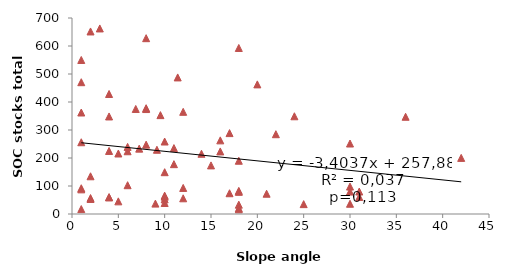
| Category | C_total |
|---|---|
| 6.0 | 102.815 |
| 3.0 | 662.671 |
| 17.0 | 288.947 |
| 1.0 | 362.455 |
| 1.0 | 256.288 |
| 30.0 | 251.709 |
| 20.0 | 462.897 |
| 17.0 | 74.214 |
| 8.0 | 377.819 |
| 1.0 | 470.715 |
| 30.0 | 79.973 |
| 8.0 | 247.699 |
| 10.0 | 62.035 |
| 2.0 | 651.921 |
| 9.0 | 37.113 |
| 12.0 | 93.084 |
| 5.0 | 45.168 |
| 18.0 | 79.079 |
| 18.0 | 33.313 |
| 18.0 | 592.914 |
| 6.0 | 224.095 |
| 31.0 | 80.297 |
| 31.0 | 60.733 |
| 18.0 | 190.189 |
| 1.0 | 17.528 |
| 1.0 | 92.069 |
| 15.0 | 173.554 |
| 12.0 | 56.097 |
| 10.0 | 149.285 |
| 5.0 | 216.118 |
| 1.0 | 550.08 |
| 4.0 | 428.618 |
| 10.0 | 39.318 |
| 4.0 | 59.683 |
| 30.0 | 97.969 |
| 12.0 | 364.905 |
| 4.0 | 348.337 |
| 2.0 | 53.682 |
| 8.0 | 374.794 |
| 22.0 | 284.982 |
| 18.0 | 20.421 |
| 25.0 | 35.267 |
| 18.0 | 82.651 |
| 16.0 | 262.961 |
| 11.0 | 235.38 |
| 11.0 | 178.005 |
| 10.0 | 52.242 |
| 4.0 | 225.178 |
| 1.0 | 87.964 |
| 2.0 | 56.941 |
| 8.0 | 627.933 |
| 6.0 | 239.658 |
| 4.0 | 59.839 |
| 10.0 | 65.646 |
| 10.0 | 258.838 |
| 2.0 | 134.735 |
| 36.0 | 347.236 |
| 24.0 | 349.039 |
| 16.0 | 223.453 |
| 42.0 | 200.402 |
| 21.0 | 72.403 |
| 30.0 | 36.592 |
| 18.0 | 16.724 |
| 6.878966809496639 | 375.112 |
| 11.405607506230629 | 487.774 |
| 9.544255104598921 | 353.125 |
| 7.252504912122541 | 233.469 |
| 9.165459574699716 | 229.423 |
| 13.971718167492144 | 215.148 |